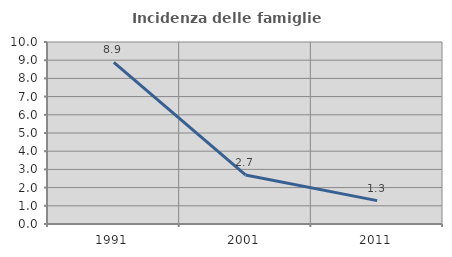
| Category | Incidenza delle famiglie numerose |
|---|---|
| 1991.0 | 8.879 |
| 2001.0 | 2.697 |
| 2011.0 | 1.284 |